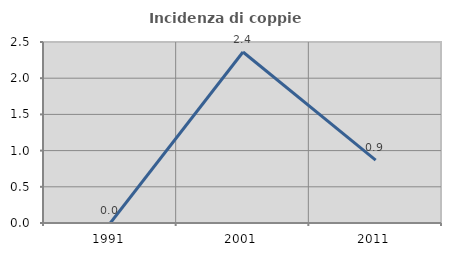
| Category | Incidenza di coppie miste |
|---|---|
| 1991.0 | 0 |
| 2001.0 | 2.362 |
| 2011.0 | 0.87 |